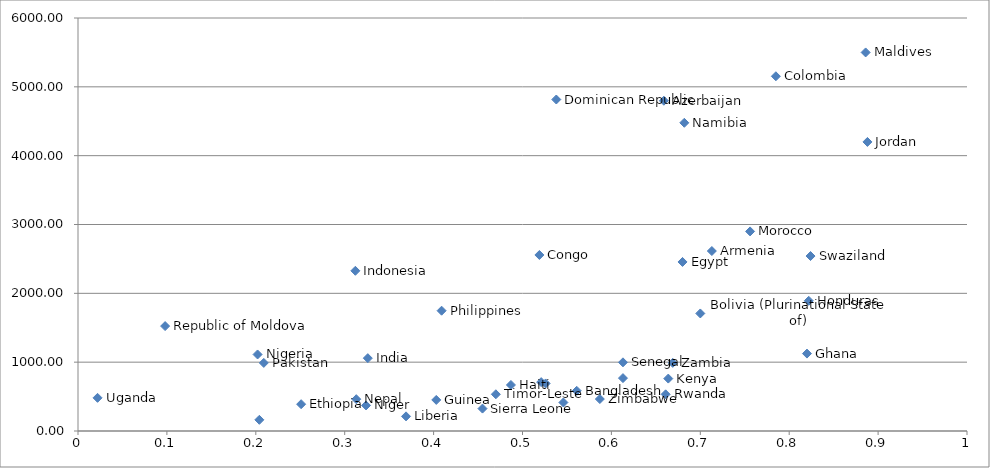
| Category | GDP |
|---|---|
| 0.713 | 2614.702 |
| 0.659 | 4798.235 |
| 0.561 | 583.973 |
| 0.521 | 709.824 |
| 0.7000000000000001 | 1707.624 |
| 0.613 | 768.366 |
| 0.785 | 5153.504 |
| 0.519 | 2557.306 |
| 0.204 | 162.385 |
| 0.538 | 4815.8 |
| 0.68 | 2455.827 |
| 0.251 | 389.429 |
| 0.8200000000000001 | 1124.655 |
| 0.40299999999999997 | 451.47 |
| 0.48700000000000004 | 668.559 |
| 0.8220000000000001 | 1891.57 |
| 0.326 | 1058.226 |
| 0.312 | 2327.26 |
| 0.888 | 4199.498 |
| 0.664 | 761.503 |
| 0.369 | 212.69 |
| 0.546 | 413.875 |
| 0.886 | 5499.489 |
| 0.526 | 690.823 |
| 0.756 | 2899.46 |
| 0.682 | 4477.589 |
| 0.313 | 461.951 |
| 0.324 | 371.567 |
| 0.20199999999999999 | 1111.747 |
| 0.209 | 989.253 |
| 0.409 | 1747.823 |
| 0.098 | 1524.232 |
| 0.6609999999999999 | 532.641 |
| 0.613 | 997.608 |
| 0.455 | 325.663 |
| 0.8240000000000001 | 2541.86 |
| 0.47000000000000003 | 533.54 |
| 0.022000000000000002 | 481.864 |
| 0.669 | 989.952 |
| 0.5870000000000001 | 464.101 |